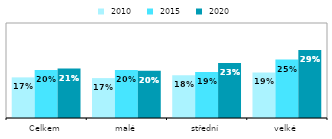
| Category |  2010 |  2015 |  2020 |
|---|---|---|---|
| Celkem | 0.171 | 0.202 | 0.208 |
| malé | 0.168 | 0.202 | 0.199 |
| střední | 0.18 | 0.194 | 0.232 |
| velké | 0.192 | 0.246 | 0.286 |